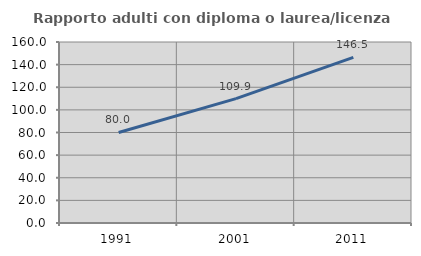
| Category | Rapporto adulti con diploma o laurea/licenza media  |
|---|---|
| 1991.0 | 80.029 |
| 2001.0 | 109.928 |
| 2011.0 | 146.452 |